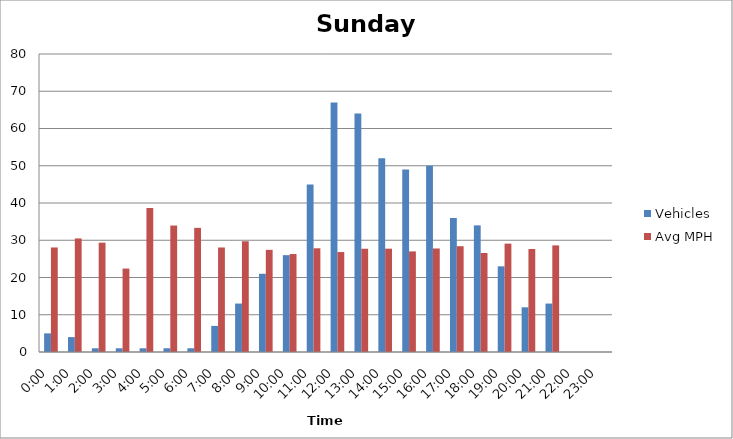
| Category | Vehicles | Avg MPH |
|---|---|---|
| 0:00 | 5 | 28.06 |
| 1:00 | 4 | 30.49 |
| 2:00 | 1 | 29.35 |
| 3:00 | 1 | 22.4 |
| 4:00 | 1 | 38.69 |
| 5:00 | 1 | 33.95 |
| 6:00 | 1 | 33.33 |
| 7:00 | 7 | 28.06 |
| 8:00 | 13 | 29.73 |
| 9:00 | 21 | 27.42 |
| 10:00 | 26 | 26.3 |
| 11:00 | 45 | 27.84 |
| 12:00 | 67 | 26.83 |
| 13:00 | 64 | 27.72 |
| 14:00 | 52 | 27.74 |
| 15:00 | 49 | 27 |
| 16:00 | 50 | 27.79 |
| 17:00 | 36 | 28.4 |
| 18:00 | 34 | 26.57 |
| 19:00 | 23 | 29.09 |
| 20:00 | 12 | 27.65 |
| 21:00 | 13 | 28.62 |
| 22:00 | 0 | 0 |
| 23:00 | 0 | 0 |